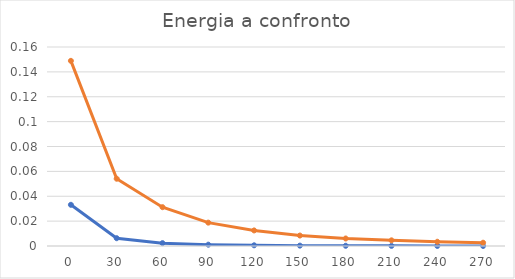
| Category | Series 0 | Series 1 |
|---|---|---|
| 0.0 | 0.033 | 0.116 |
| 30.0 | 0.006 | 0.048 |
| 60.0 | 0.002 | 0.029 |
| 90.0 | 0.001 | 0.018 |
| 120.0 | 0.001 | 0.012 |
| 150.0 | 0 | 0.008 |
| 180.0 | 0 | 0.006 |
| 210.0 | 0 | 0.004 |
| 240.0 | 0 | 0.003 |
| 270.0 | 0 | 0.003 |